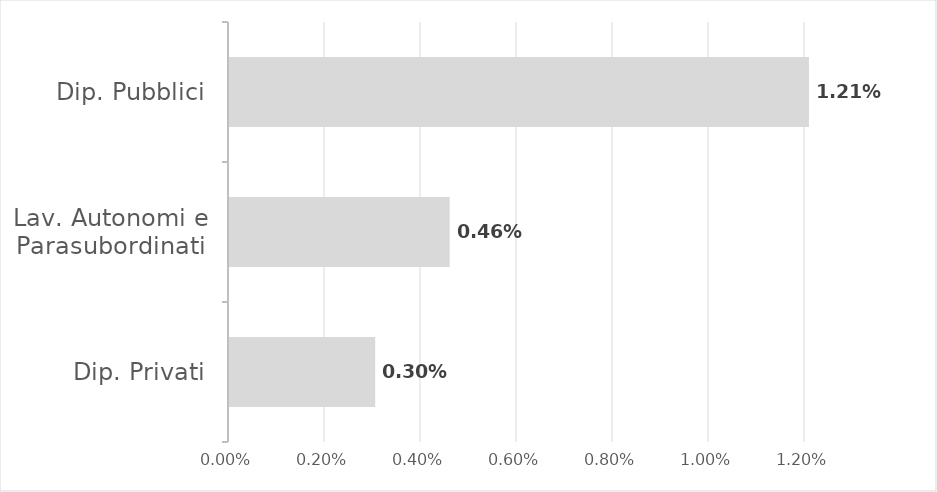
| Category | Series 0 |
|---|---|
| Dip. Privati | 0.003 |
| Lav. Autonomi e Parasubordinati | 0.005 |
| Dip. Pubblici | 0.012 |